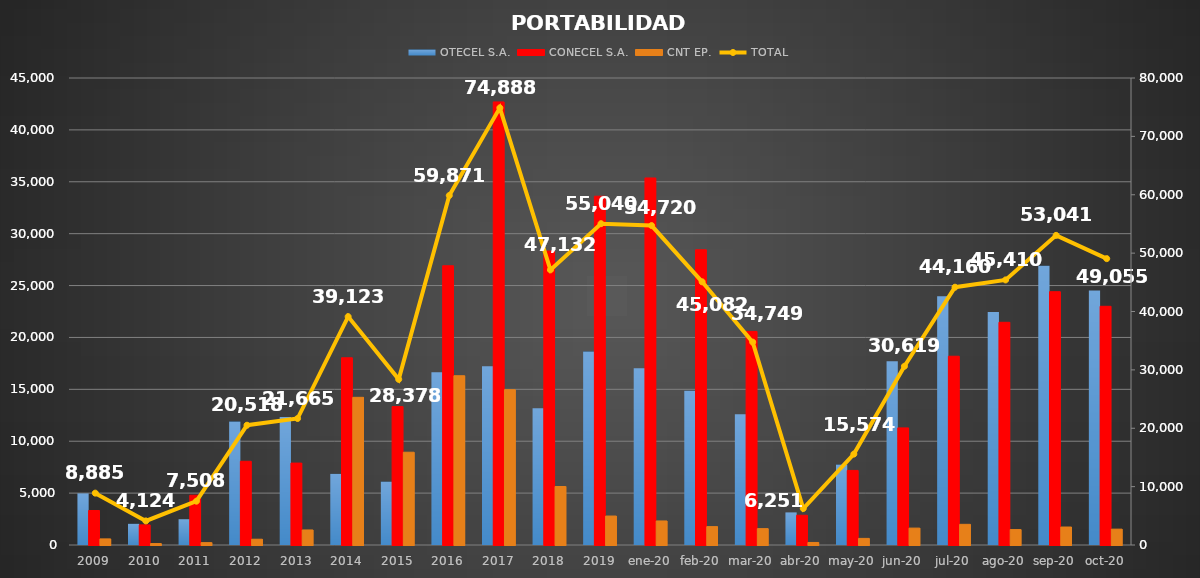
| Category | OTECEL S.A. | CONECEL S.A. | CNT EP. |
|---|---|---|---|
| 2009 | 4973 | 3324 | 588 |
| 2010 | 2045 | 1939 | 140 |
| 2011 | 2484 | 4796 | 228 |
| 2012 | 11894 | 8067 | 557 |
| 2013 | 12323 | 7893 | 1449 |
| 2014 | 6853 | 18039 | 14231 |
| 2015 | 6105 | 13334 | 8939 |
| 2016 | 16653 | 26907 | 16311 |
| 2017 | 17228 | 42694 | 14966 |
| 2018 | 13166 | 28329 | 5637 |
| 2019 | 18642 | 33608 | 2790 |
| ene-20 | 17036 | 35368 | 2316 |
| feb-20 | 14864 | 28446 | 1772 |
| mar-20 | 12593 | 20579 | 1577 |
| abr-20 | 3141 | 2866 | 244 |
| may-20 | 7752 | 7186 | 636 |
| jun-20 | 17706 | 11285 | 1628 |
| jul-20 | 23981 | 18188 | 1991 |
| ago-20 | 22463 | 21459 | 1488 |
| sep-20 | 26900 | 24409 | 1732 |
| oct-20 | 24527 | 23000 | 1528 |